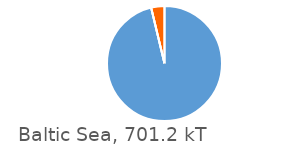
| Category | Baltic Sea |
|---|---|
| 0 | 674969 |
| 1 | 0 |
| 2 | 26230 |